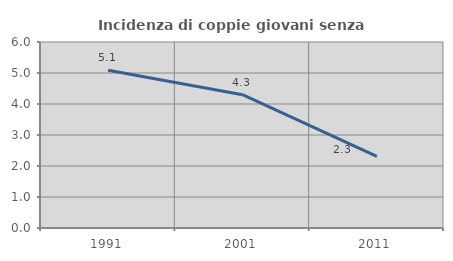
| Category | Incidenza di coppie giovani senza figli |
|---|---|
| 1991.0 | 5.092 |
| 2001.0 | 4.299 |
| 2011.0 | 2.308 |